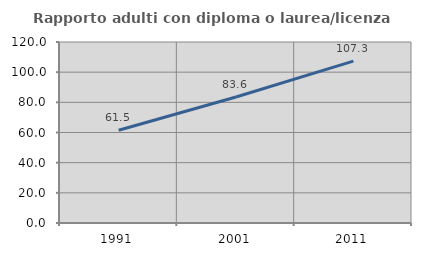
| Category | Rapporto adulti con diploma o laurea/licenza media  |
|---|---|
| 1991.0 | 61.527 |
| 2001.0 | 83.565 |
| 2011.0 | 107.294 |